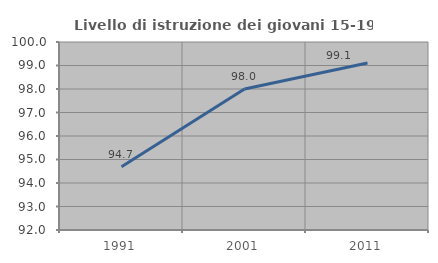
| Category | Livello di istruzione dei giovani 15-19 anni |
|---|---|
| 1991.0 | 94.69 |
| 2001.0 | 98 |
| 2011.0 | 99.107 |